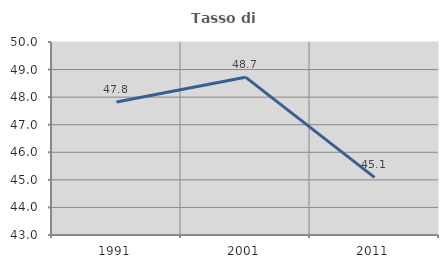
| Category | Tasso di occupazione   |
|---|---|
| 1991.0 | 47.826 |
| 2001.0 | 48.724 |
| 2011.0 | 45.088 |